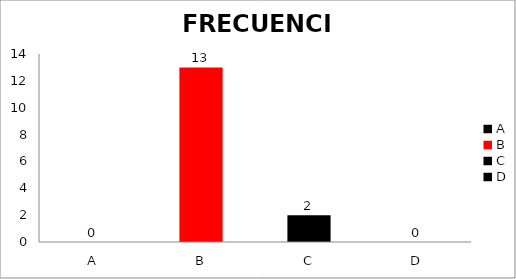
| Category | Series 0 |
|---|---|
| A | 0 |
| B | 13 |
| C | 2 |
| D | 0 |